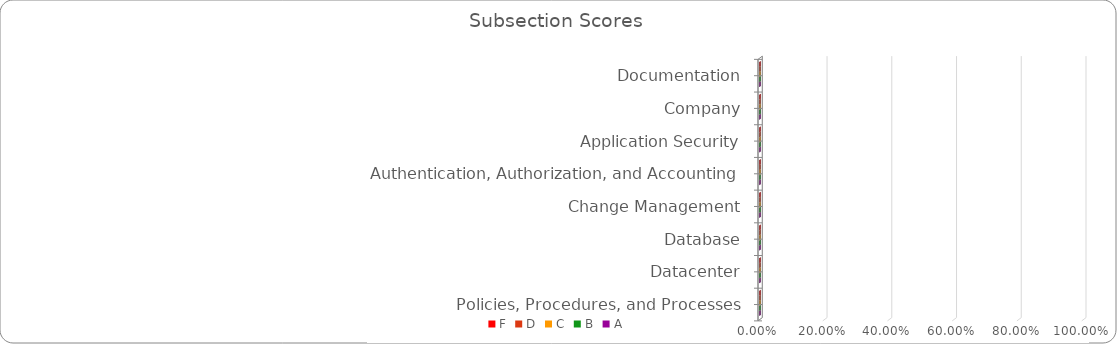
| Category | F | D | C | B | A |
|---|---|---|---|---|---|
| Documentation | 0 | 0 | 0 | 0 | 0 |
| Company | 0 | 0 | 0 | 0 | 0 |
| Application Security | 0 | 0 | 0 | 0 | 0 |
| Authentication, Authorization, and Accounting | 0 | 0 | 0 | 0 | 0 |
| Change Management | 0 | 0 | 0 | 0 | 0 |
| Database | 0 | 0 | 0 | 0 | 0 |
| Datacenter | 0 | 0 | 0 | 0 | 0 |
| Policies, Procedures, and Processes | 0 | 0 | 0 | 0 | 0 |